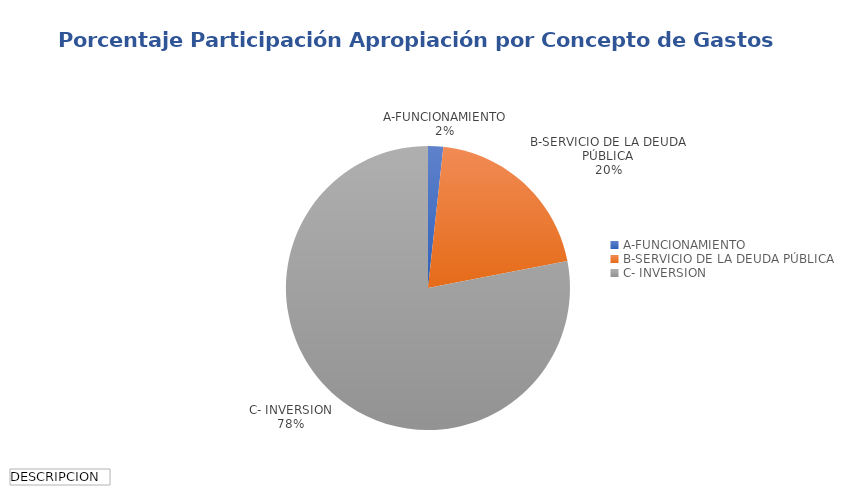
| Category | Total |
|---|---|
| A-FUNCIONAMIENTO | 99785.985 |
| B-SERVICIO DE LA DEUDA PÚBLICA | 1167604.335 |
| C- INVERSION | 4505182.025 |